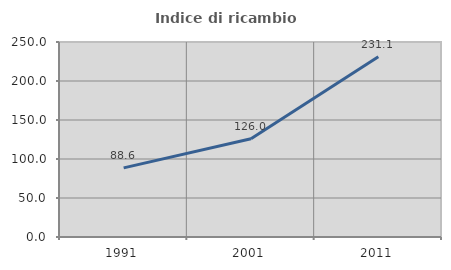
| Category | Indice di ricambio occupazionale  |
|---|---|
| 1991.0 | 88.608 |
| 2001.0 | 126 |
| 2011.0 | 231.111 |